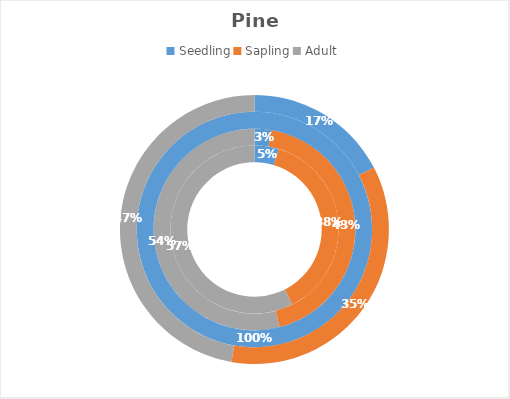
| Category | Transect part A (Ascending North-facing slope) | Transect part B (Ridgeline) | Transect part C (Descending North-facing slope) | Total |
|---|---|---|---|---|
| Seedling | 5 | 5 | 50 | 60 |
| Sapling | 41 | 81 | 0 | 122 |
| Adult | 62 | 101 | 0 | 163 |